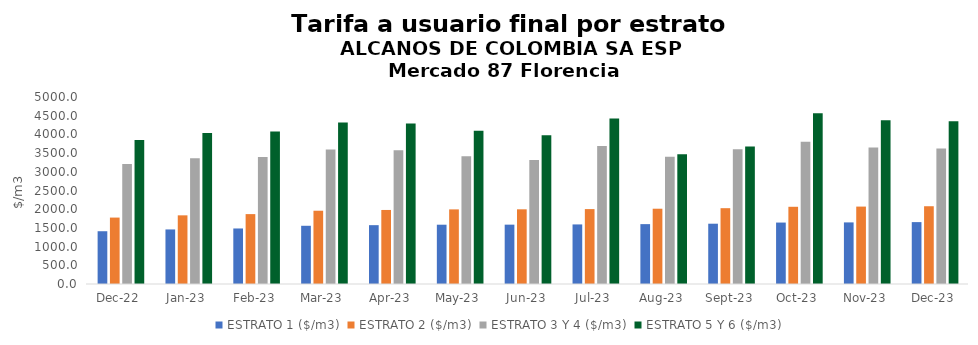
| Category | ESTRATO 1 ($/m3) | ESTRATO 2 ($/m3) | ESTRATO 3 Y 4 ($/m3) | ESTRATO 5 Y 6 ($/m3) |
|---|---|---|---|---|
| 2022-12-01 | 1410.99 | 1776 | 3209.93 | 3851.916 |
| 2023-01-01 | 1458.78 | 1836 | 3365.49 | 4038.588 |
| 2023-02-01 | 1484.64 | 1868.8 | 3398.26 | 4077.912 |
| 2023-03-01 | 1556.75 | 1959.18 | 3596.1 | 4315.32 |
| 2023-04-01 | 1573.28 | 1979.65 | 3575.22 | 4290.264 |
| 2023-05-01 | 1585.35 | 1995.07 | 3416.65 | 4099.98 |
| 2023-06-01 | 1586.86 | 1997.09 | 3316.57 | 3979.884 |
| 2023-07-01 | 1592.9 | 2003.01 | 3689.81 | 4427.772 |
| 2023-08-01 | 1600.9 | 2012.86 | 3401.48 | 3469.51 |
| 2023-09-01 | 1612.14 | 2027.25 | 3603.59 | 3675.662 |
| 2023-10-01 | 1642.77 | 2064.53 | 3805.44 | 4566.528 |
| 2023-11-01 | 1647.01 | 2069.85 | 3648.51 | 4378.212 |
| 2023-12-01 | 1654.75 | 2079.33 | 3624.28 | 4349.136 |